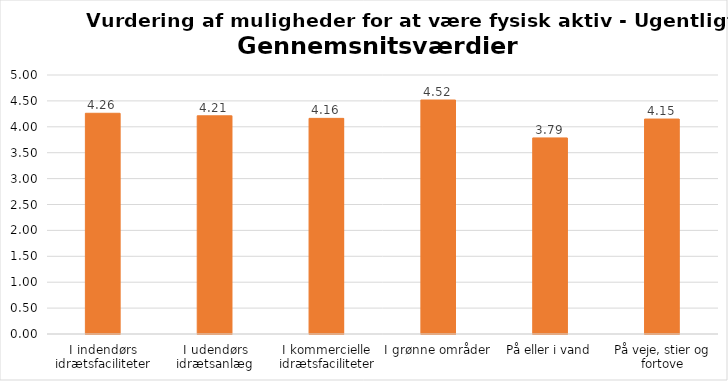
| Category | Gennemsnit |
|---|---|
| I indendørs idrætsfaciliteter | 4.261 |
| I udendørs idrætsanlæg | 4.212 |
| I kommercielle idrætsfaciliteter | 4.163 |
| I grønne områder | 4.517 |
| På eller i vand | 3.785 |
| På veje, stier og fortove | 4.15 |